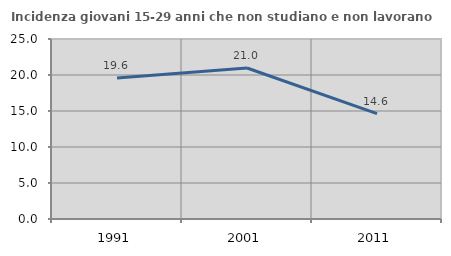
| Category | Incidenza giovani 15-29 anni che non studiano e non lavorano  |
|---|---|
| 1991.0 | 19.595 |
| 2001.0 | 20.968 |
| 2011.0 | 14.634 |